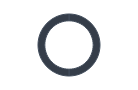
| Category | Series 0 |
|---|---|
| Preventiva | 2 |
| Corretiva | 2 |
| Preditiva | 0 |